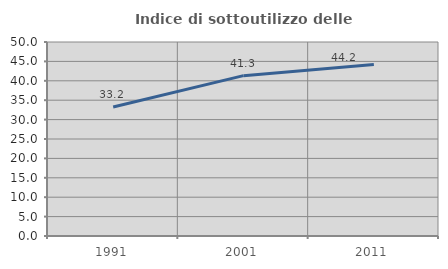
| Category | Indice di sottoutilizzo delle abitazioni  |
|---|---|
| 1991.0 | 33.228 |
| 2001.0 | 41.329 |
| 2011.0 | 44.187 |